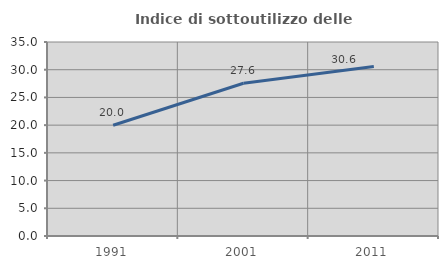
| Category | Indice di sottoutilizzo delle abitazioni  |
|---|---|
| 1991.0 | 19.988 |
| 2001.0 | 27.563 |
| 2011.0 | 30.581 |